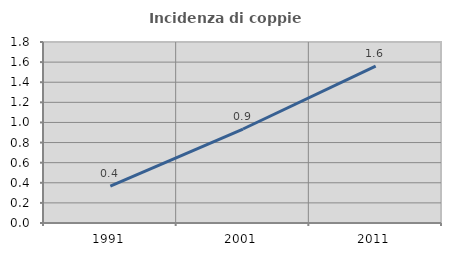
| Category | Incidenza di coppie miste |
|---|---|
| 1991.0 | 0.367 |
| 2001.0 | 0.935 |
| 2011.0 | 1.56 |